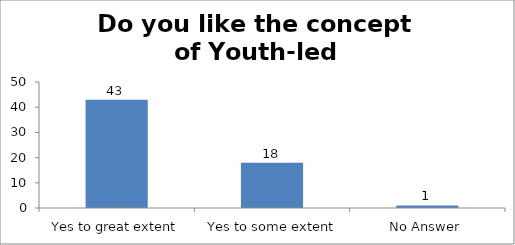
| Category | Do you like the concept of Youth-led Changemaking?  |
|---|---|
| Yes to great extent | 43 |
|  Yes to some extent | 18 |
| No Answer | 1 |